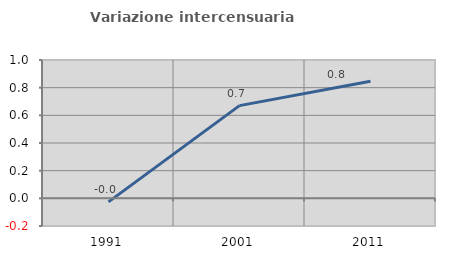
| Category | Variazione intercensuaria annua |
|---|---|
| 1991.0 | -0.026 |
| 2001.0 | 0.67 |
| 2011.0 | 0.846 |